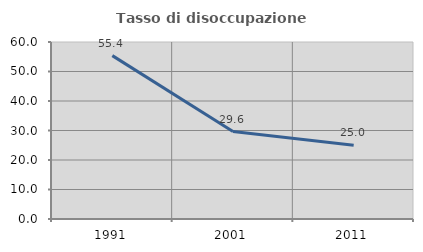
| Category | Tasso di disoccupazione giovanile  |
|---|---|
| 1991.0 | 55.385 |
| 2001.0 | 29.63 |
| 2011.0 | 25 |